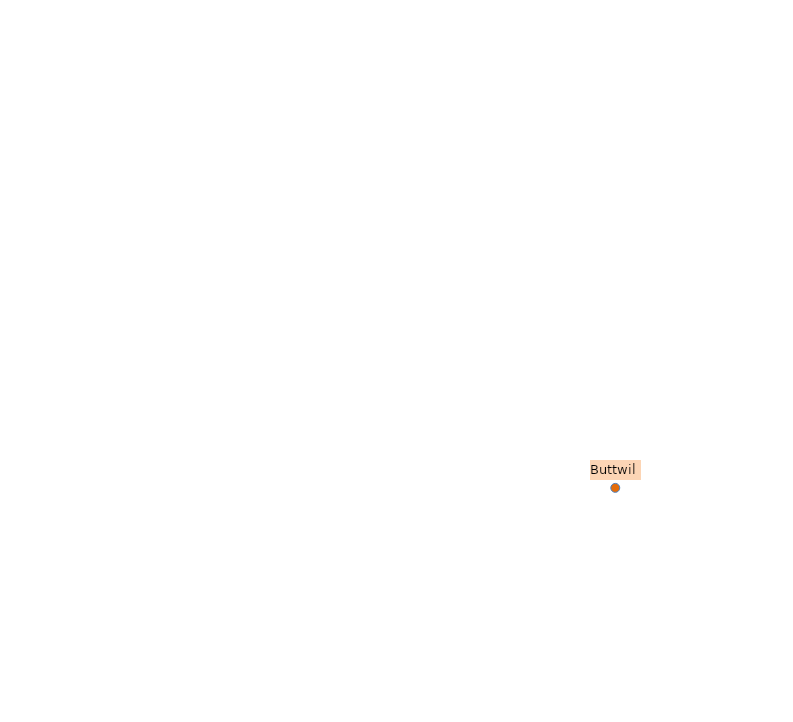
| Category | Buttwil |
|---|---|
| 12.558394327049852 | 4.036 |